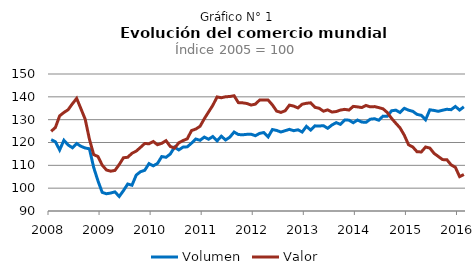
| Category | Volumen | Valor |
|---|---|---|
| 2008 | 121.24 | 124.9 |
|  | 120.334 | 126.561 |
|  | 116.736 | 131.66 |
|  | 120.967 | 133.141 |
|  | 118.931 | 134.37 |
|  | 117.702 | 136.96 |
|  | 119.562 | 139.312 |
|  | 118.351 | 134.801 |
|  | 117.593 | 130.223 |
|  | 117.248 | 121.455 |
|  | 109.077 | 114.703 |
|  | 103.225 | 113.864 |
| 2009 | 98.174 | 110.09 |
|  | 97.549 | 107.96 |
|  | 97.877 | 107.437 |
|  | 98.368 | 107.779 |
|  | 96.349 | 110.353 |
|  | 98.936 | 113.312 |
|  | 101.812 | 113.536 |
|  | 101.288 | 115.28 |
|  | 105.736 | 116.224 |
|  | 107.222 | 117.861 |
|  | 107.833 | 119.57 |
|  | 110.757 | 119.442 |
| 2010 | 109.782 | 120.434 |
|  | 110.823 | 119.02 |
|  | 113.851 | 119.645 |
|  | 113.516 | 120.807 |
|  | 114.958 | 118.272 |
|  | 117.958 | 117.547 |
|  | 116.752 | 119.865 |
|  | 117.981 | 120.845 |
|  | 118.106 | 121.619 |
|  | 119.733 | 125.251 |
|  | 121.518 | 125.887 |
|  | 120.961 | 127.096 |
| 2011 | 122.361 | 130.417 |
|  | 121.427 | 133.364 |
|  | 122.622 | 136.279 |
|  | 120.695 | 139.953 |
|  | 122.77 | 139.605 |
|  | 121.098 | 140.031 |
|  | 122.34 | 140.139 |
|  | 124.58 | 140.48 |
|  | 123.497 | 137.461 |
|  | 123.371 | 137.367 |
|  | 123.575 | 137.091 |
|  | 123.627 | 136.397 |
| 2012 | 122.97 | 136.8 |
|  | 123.998 | 138.593 |
|  | 124.354 | 138.636 |
|  | 122.444 | 138.575 |
|  | 125.675 | 136.467 |
|  | 125.286 | 133.756 |
|  | 124.597 | 133.175 |
|  | 125.175 | 133.895 |
|  | 125.761 | 136.361 |
|  | 125.167 | 135.947 |
|  | 125.564 | 135.137 |
|  | 124.603 | 136.769 |
| 2013 | 127.065 | 137.177 |
|  | 125.442 | 137.377 |
|  | 127.289 | 135.406 |
|  | 127.231 | 134.986 |
|  | 127.355 | 133.71 |
|  | 126.219 | 134.295 |
|  | 127.674 | 133.332 |
|  | 128.697 | 133.558 |
|  | 127.947 | 134.21 |
|  | 129.836 | 134.51 |
|  | 129.79 | 134.213 |
|  | 128.671 | 135.821 |
| 2014 | 129.832 | 135.6 |
|  | 128.956 | 135.301 |
|  | 128.828 | 136.225 |
|  | 130.198 | 135.613 |
|  | 130.41 | 135.724 |
|  | 129.759 | 135.284 |
|  | 131.547 | 134.757 |
|  | 131.481 | 133.124 |
|  | 133.876 | 130.591 |
|  | 134.174 | 128.461 |
|  | 133.131 | 126.392 |
|  | 134.966 | 123.19 |
| 2015 | 134.16 | 119.012 |
|  | 133.651 | 118.022 |
|  | 132.305 | 115.931 |
|  | 131.894 | 115.873 |
|  | 129.966 | 118.019 |
|  | 134.32 | 117.565 |
|  | 134.039 | 115.242 |
|  | 133.66 | 113.862 |
|  | 134.138 | 112.503 |
|  | 134.547 | 112.48 |
|  | 134.372 | 110.201 |
|  | 135.77 | 109.14 |
| 2016 | 134.216 | 105.054 |